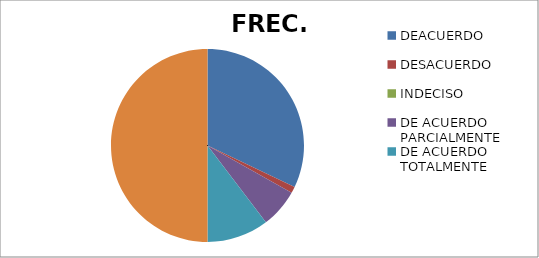
| Category | FREC. | % |
|---|---|---|
| DEACUERDO | 301 | 0.64 |
| DESACUERDO | 10 | 0.02 |
| INDECISO | 0 | 0 |
| DE ACUERDO PARCIALMENTE | 61 | 0.13 |
| DE ACUERDO TOTALMENTE | 97 | 0.21 |
| TOTAL | 469 | 1 |